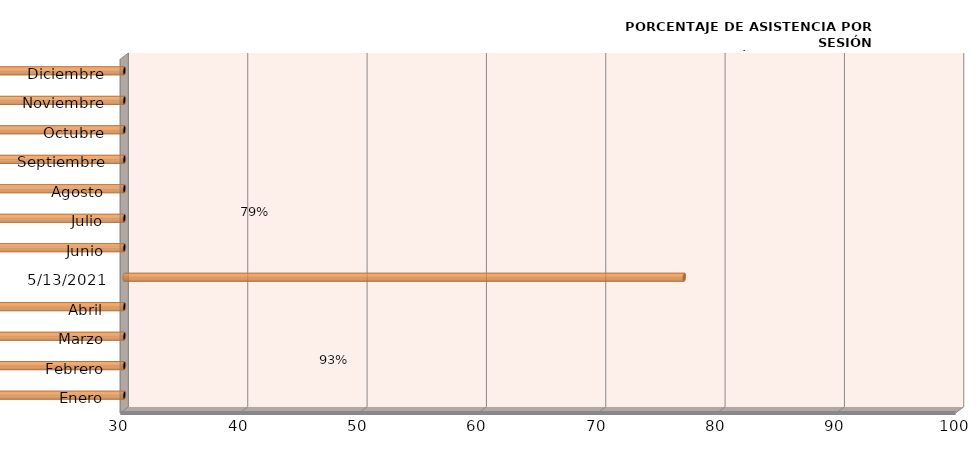
| Category | Series 0 |
|---|---|
| Enero | 0 |
| Febrero | 0 |
| Marzo | 0 |
| Abril | 0 |
| 13/05/2021 | 76.923 |
| Junio | 0 |
| Julio | 0 |
| Agosto | 0 |
| Septiembre | 0 |
| Octubre | 0 |
| Noviembre | 0 |
| Diciembre | 0 |